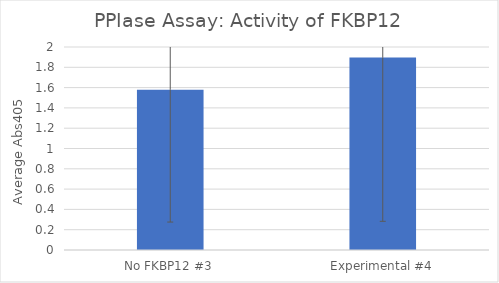
| Category | Series 0 |
|---|---|
| No FKBP12 #3 | 1.58 |
| Experimental #4 | 1.897 |